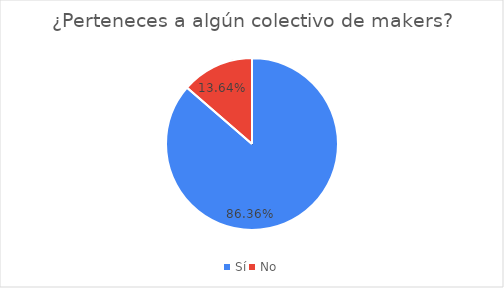
| Category | ¿Perteneces a algún colectivo de makers? |
|---|---|
| Sí | 0.864 |
| No | 0.136 |